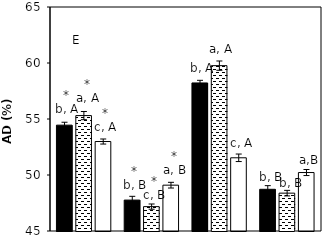
| Category |    A. brasilense |    A. chroococcum |    CK |
|---|---|---|---|
| aCO2-Bt | 54.451 | 55.304 | 52.989 |
| aCO2-XIANYU | 47.759 | 47.177 | 49.092 |
| eCO2-Bt | 58.22 | 59.764 | 51.537 |
| eCO2-XIANYU | 48.723 | 48.38 | 50.22 |